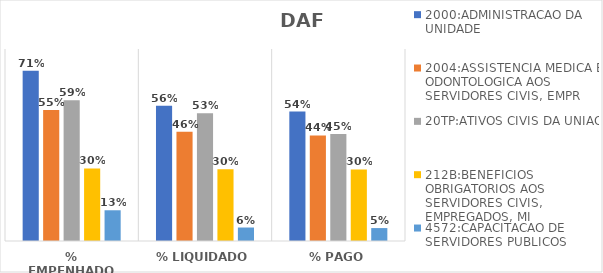
| Category | 2000:ADMINISTRACAO DA UNIDADE | 2004:ASSISTENCIA MEDICA E ODONTOLOGICA AOS SERVIDORES CIVIS, EMPR | 20TP:ATIVOS CIVIS DA UNIAO | 212B:BENEFICIOS OBRIGATORIOS AOS SERVIDORES CIVIS, EMPREGADOS, MI | 4572:CAPACITACAO DE SERVIDORES PUBLICOS FEDERAIS EM PROCESSO DE Q |
|---|---|---|---|---|---|
| % EMPENHADO | 0.71 | 0.545 | 0.587 | 0.303 | 0.128 |
| % LIQUIDADO | 0.564 | 0.456 | 0.532 | 0.299 | 0.056 |
| % PAGO | 0.539 | 0.44 | 0.446 | 0.298 | 0.054 |